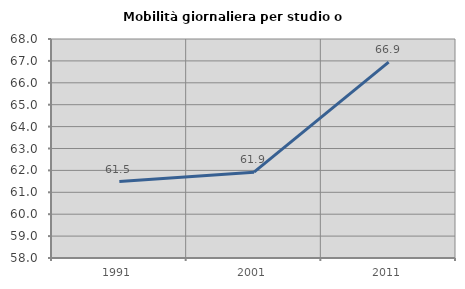
| Category | Mobilità giornaliera per studio o lavoro |
|---|---|
| 1991.0 | 61.488 |
| 2001.0 | 61.92 |
| 2011.0 | 66.941 |